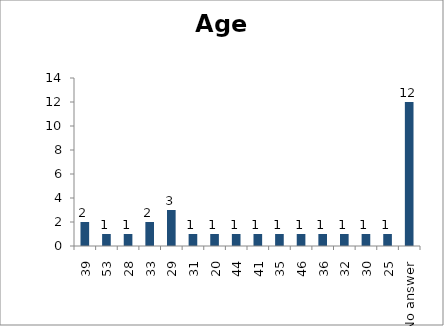
| Category | Age |
|---|---|
| 39 | 2 |
| 53 | 1 |
| 28 | 1 |
| 33 | 2 |
| 29 | 3 |
| 31 | 1 |
| 20 | 1 |
| 44 | 1 |
| 41 | 1 |
| 35 | 1 |
| 46 | 1 |
| 36 | 1 |
| 32 | 1 |
| 30 | 1 |
| 25 | 1 |
| No answer | 12 |